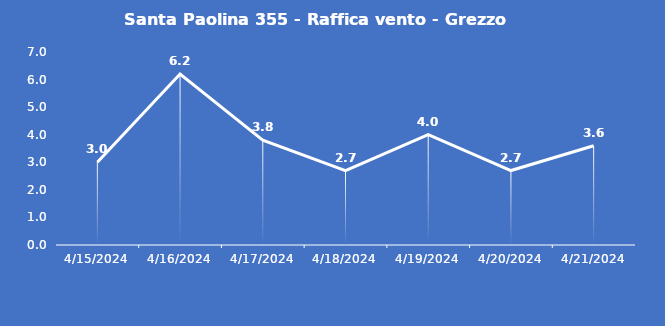
| Category | Santa Paolina 355 - Raffica vento - Grezzo (m/s) |
|---|---|
| 4/15/24 | 3 |
| 4/16/24 | 6.2 |
| 4/17/24 | 3.8 |
| 4/18/24 | 2.7 |
| 4/19/24 | 4 |
| 4/20/24 | 2.7 |
| 4/21/24 | 3.6 |